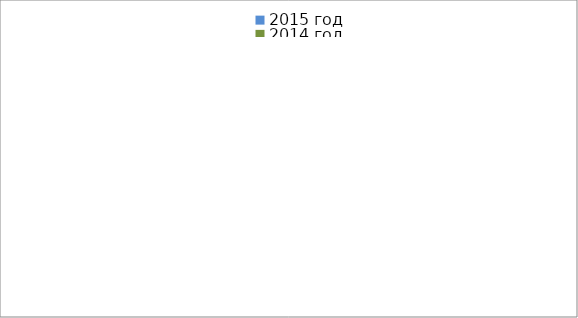
| Category | 2015 год | 2014 год |
|---|---|---|
|  - поджог | 17 | 16 |
|  - неосторожное обращение с огнём | 43 | 26 |
|  - НПТЭ электрооборудования | 8 | 16 |
|  - НПУ и Э печей | 41 | 48 |
|  - НПУ и Э транспортных средств | 39 | 45 |
|   -Шалость с огнем детей | 3 | 0 |
|  -НППБ при эксплуатации эл.приборов | 11 | 16 |
|  - курение | 18 | 17 |
| - прочие | 62 | 71 |
| - не установленные причины | 7 | 7 |